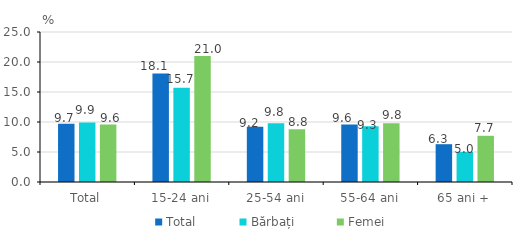
| Category | Total | Bărbați | Femei |
|---|---|---|---|
| Total | 9.7 | 9.9 | 9.6 |
| 15-24 ani | 18.1 | 15.7 | 21 |
| 25-54 ani | 9.2 | 9.8 | 8.8 |
| 55-64 ani | 9.6 | 9.3 | 9.8 |
| 65 ani + | 6.3 | 5 | 7.7 |